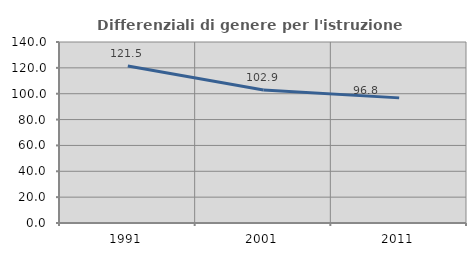
| Category | Differenziali di genere per l'istruzione superiore |
|---|---|
| 1991.0 | 121.498 |
| 2001.0 | 102.931 |
| 2011.0 | 96.783 |